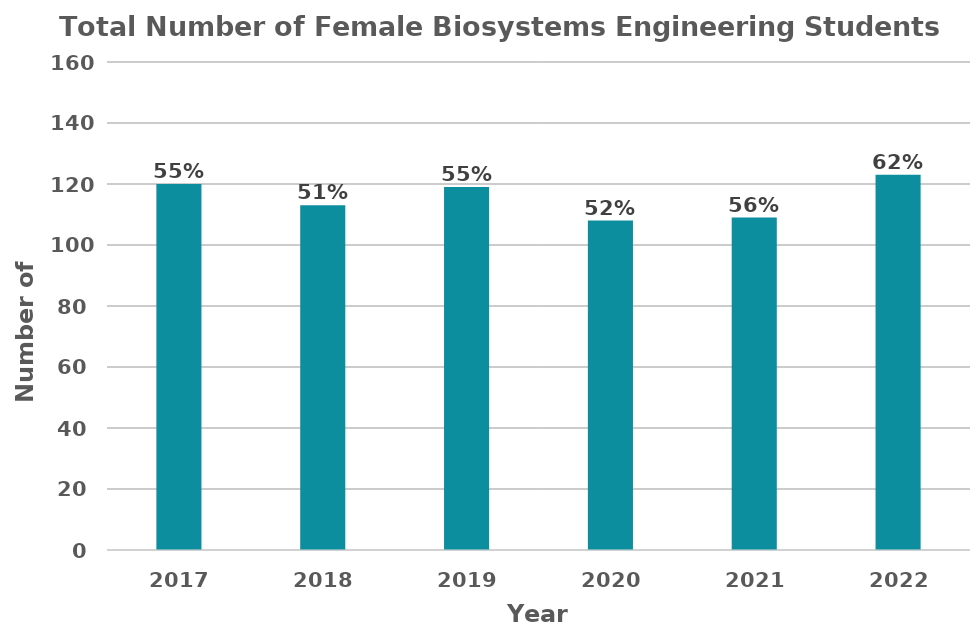
| Category | Total Number of Female Biosystem Engineering Students |
|---|---|
| 2017.0 | 120 |
| 2018.0 | 113 |
| 2019.0 | 119 |
| 2020.0 | 108 |
| 2021.0 | 109 |
| 2022.0 | 123 |